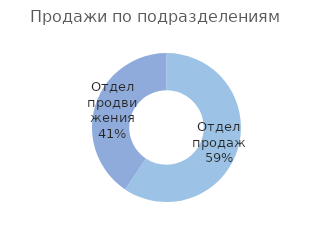
| Category | Итог |
|---|---|
| Отдел продаж | 2042412413.771 |
| Отдел продвижения | 1397473947.373 |